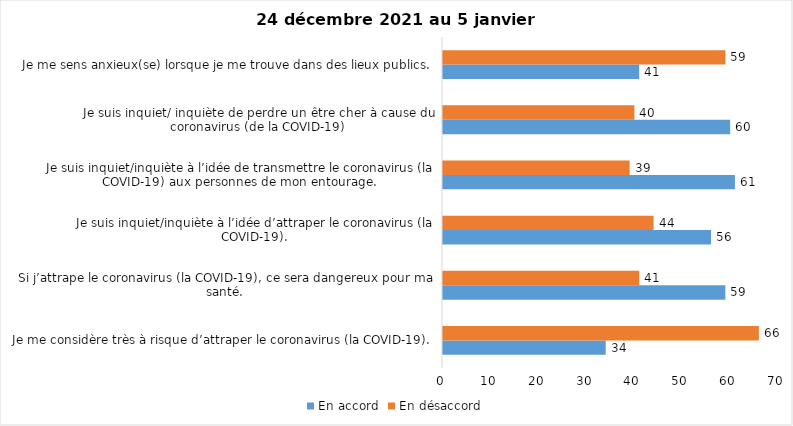
| Category | En accord | En désaccord |
|---|---|---|
| Je me considère très à risque d’attraper le coronavirus (la COVID-19). | 34 | 66 |
| Si j’attrape le coronavirus (la COVID-19), ce sera dangereux pour ma santé. | 59 | 41 |
| Je suis inquiet/inquiète à l’idée d’attraper le coronavirus (la COVID-19). | 56 | 44 |
| Je suis inquiet/inquiète à l’idée de transmettre le coronavirus (la COVID-19) aux personnes de mon entourage. | 61 | 39 |
| Je suis inquiet/ inquiète de perdre un être cher à cause du coronavirus (de la COVID-19) | 60 | 40 |
| Je me sens anxieux(se) lorsque je me trouve dans des lieux publics. | 41 | 59 |